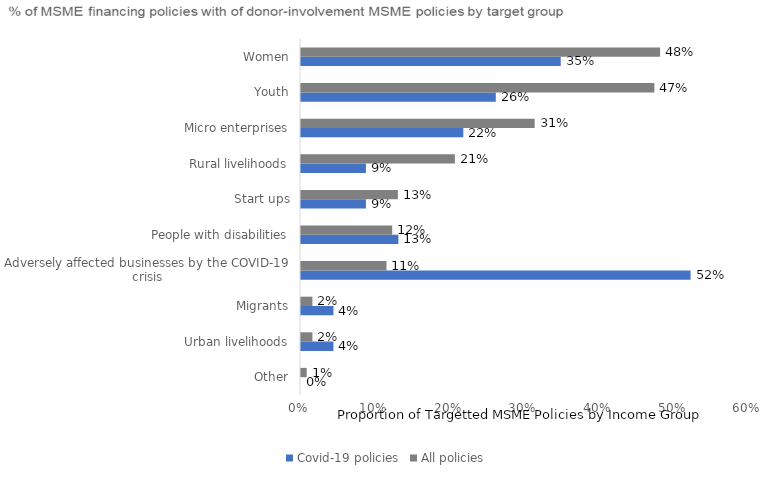
| Category | Covid-19 policies | All policies |
|---|---|---|
| Other | 0 | 0.008 |
| Urban livelihoods | 0.043 | 0.015 |
| Migrants | 0.043 | 0.015 |
| Adversely affected businesses by the COVID-19 crisis | 0.522 | 0.115 |
| People with disabilities | 0.13 | 0.122 |
| Start ups | 0.087 | 0.13 |
| Rural livelihoods | 0.087 | 0.206 |
| Micro enterprises | 0.217 | 0.313 |
| Youth | 0.261 | 0.473 |
| Women | 0.348 | 0.481 |